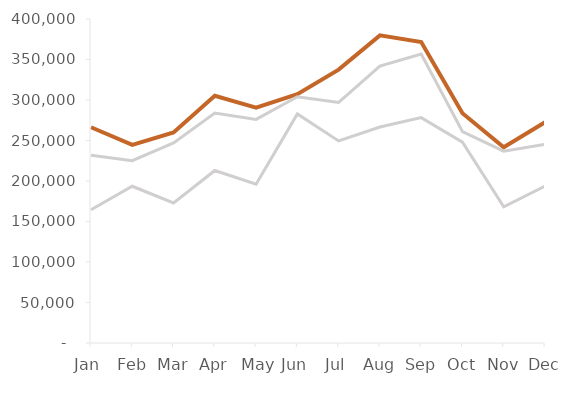
| Category | Series 0 | Series 1 | Series 2 |
|---|---|---|---|
|  Jan  | 266327.1 | 231704.577 | 164510.25 |
|  Feb  | 244601.28 | 225033.178 | 193528.533 |
|  Mar  | 260015 | 247014.25 | 172909.975 |
|  Apr  | 305290.65 | 283920.304 | 212940.228 |
|  May  | 290616 | 276085.2 | 196020.492 |
|  Jun  | 307114.5 | 304043.355 | 282760.32 |
|  Jul  | 337473.6 | 296976.768 | 249460.485 |
|  Aug  | 379815 | 341833.5 | 266630.13 |
|  Sep  | 371540.4 | 356678.784 | 278209.452 |
|  Oct  | 283709 | 261012.28 | 247961.666 |
|  Nov  | 241695.2 | 236861.296 | 168171.52 |
|  Dec  | 272442 | 245197.8 | 193706.262 |